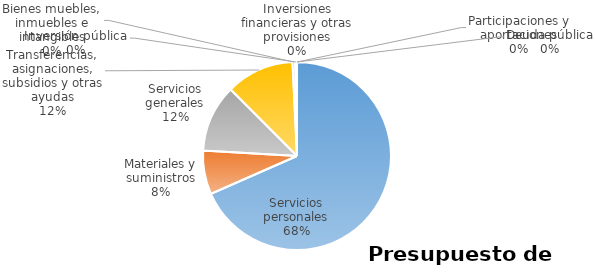
| Category | Series 0 | Series 1 | Series 2 | Series 3 | Series 4 | Series 5 |
|---|---|---|---|---|---|---|
| Servicios personales | 263302257 |  |  |  |  |  |
| Materiales y suministros | 28951979 |  |  |  |  |  |
| Servicios generales | 44582005 |  |  |  |  |  |
| Transferencias, asignaciones, subsidios y otras ayudas | 45096950 |  |  |  |  |  |
| Bienes muebles, inmuebles e intangibles | 1697960 |  |  |  |  |  |
| Inversión pública | 1250000 |  |  |  |  |  |
| Inversiones financieras y otras provisiones | 0 |  |  |  |  |  |
| Participaciones y aportaciones | 0 |  |  |  |  |  |
| Deuda pública | 0 |  |  |  |  |  |